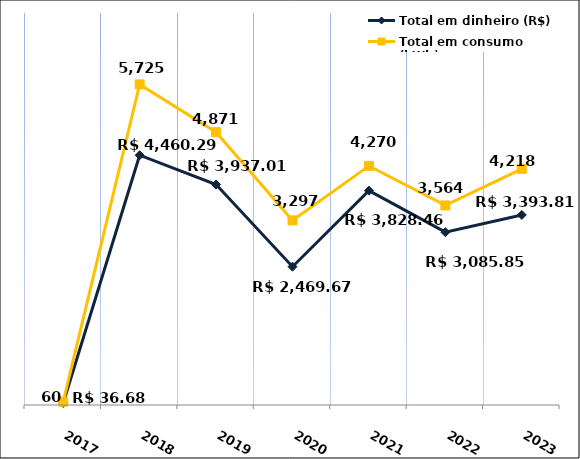
| Category | Total em dinheiro (R$) |
|---|---|
| 2017.0 | 36.68 |
| 2018.0 | 4460.29 |
| 2019.0 | 3937.01 |
| 2020.0 | 2469.67 |
| 2021.0 | 3828.46 |
| 2022.0 | 3085.85 |
| 2023.0 | 3393.81 |